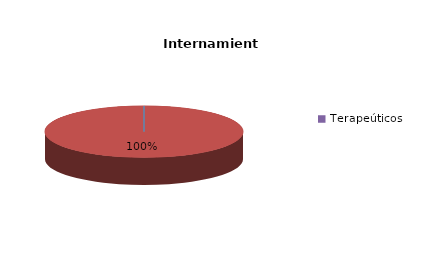
| Category | Series 0 |
|---|---|
| Cerrado | 0 |
| Semiabierto | 5 |
| Abierto | 0 |
| Terapeúticos | 0 |